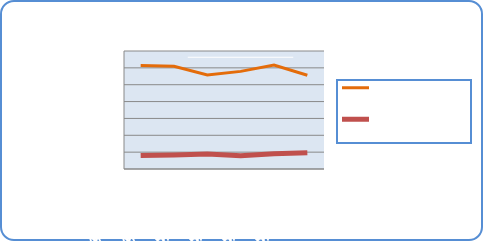
| Category | Motorin Türleri | Benzin Türleri |
|---|---|---|
| 4/29/19 | 61414264.722 | 8078893.818 |
| 4/30/19 | 60984982.584 | 8375273.236 |
| 5/1/19 | 55769344.801 | 8851707.107 |
| 5/2/19 | 57915525.349 | 7890001.732 |
| 5/3/19 | 61672698.39 | 9077009.016 |
| 5/4/19 | 55594417.849 | 9698164.881 |